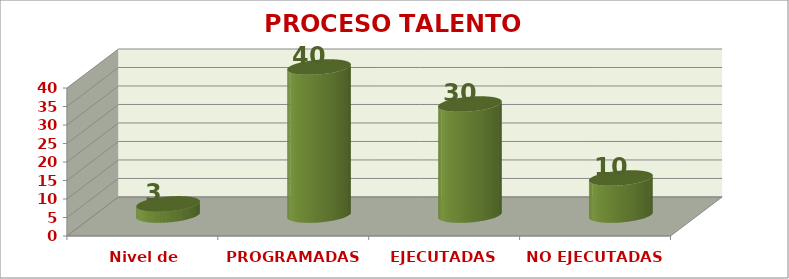
| Category | PROCESO TALENTO HUMANO |
|---|---|
| Nivel de satisfacción | 3 |
| PROGRAMADAS | 40 |
| EJECUTADAS | 30 |
| NO EJECUTADAS | 10 |